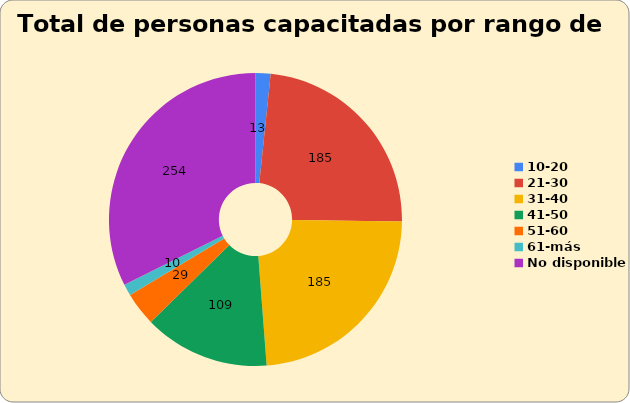
| Category | Cantidad de personas capacitadas por edad en modalidad virtual |
|---|---|
| 10-20 | 13 |
| 21-30 | 185 |
| 31-40 | 185 |
| 41-50 | 109 |
| 51-60 | 29 |
| 61-más | 10 |
| No disponible | 254 |